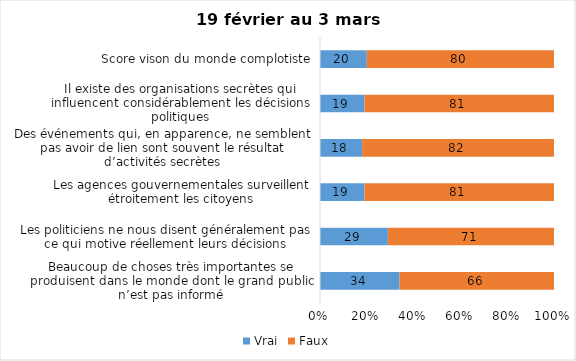
| Category | Vrai | Faux |
|---|---|---|
| Beaucoup de choses très importantes se produisent dans le monde dont le grand public n’est pas informé | 34 | 66 |
| Les politiciens ne nous disent généralement pas ce qui motive réellement leurs décisions | 29 | 71 |
| Les agences gouvernementales surveillent étroitement les citoyens | 19 | 81 |
| Des événements qui, en apparence, ne semblent pas avoir de lien sont souvent le résultat d’activités secrètes | 18 | 82 |
| Il existe des organisations secrètes qui influencent considérablement les décisions politiques | 19 | 81 |
| Score vison du monde complotiste | 20 | 80 |